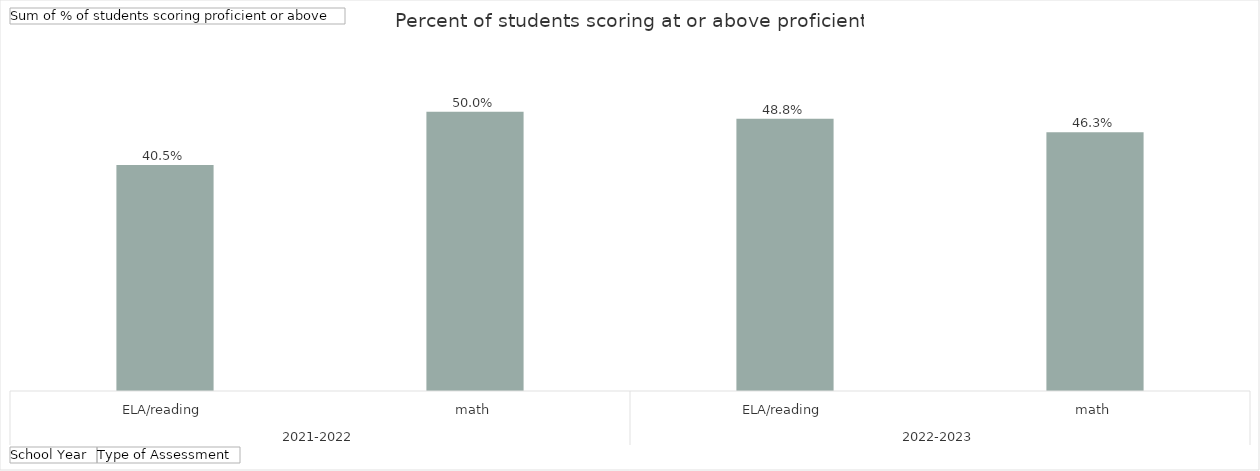
| Category | Total |
|---|---|
| 0 | 0.405 |
| 1 | 0.5 |
| 2 | 0.488 |
| 3 | 0.463 |